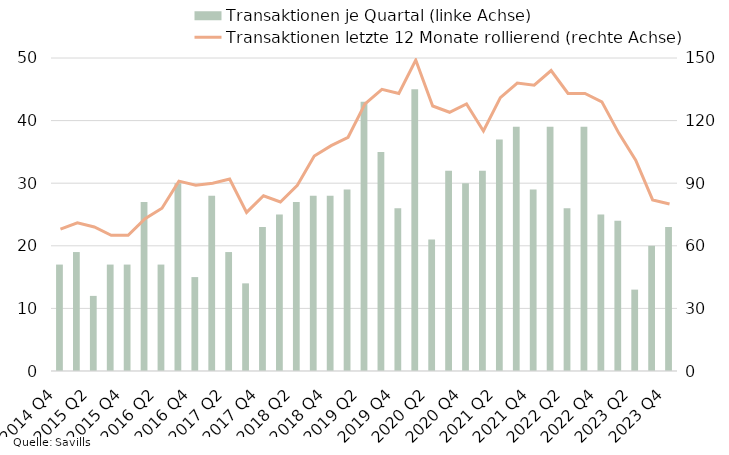
| Category | Transaktionen je Quartal (linke Achse) |
|---|---|
| 2014 Q4 | 17 |
| 2015 Q1 | 19 |
| 2015 Q2 | 12 |
| 2015 Q3 | 17 |
| 2015 Q4 | 17 |
| 2016 Q1 | 27 |
| 2016 Q2 | 17 |
| 2016 Q3 | 30 |
| 2016 Q4 | 15 |
| 2017 Q1 | 28 |
| 2017 Q2 | 19 |
| 2017 Q3 | 14 |
| 2017 Q4 | 23 |
| 2018 Q1 | 25 |
| 2018 Q2 | 27 |
| 2018 Q3 | 28 |
| 2018 Q4 | 28 |
| 2019 Q1 | 29 |
| 2019 Q2 | 43 |
| 2019 Q3 | 35 |
| 2019 Q4 | 26 |
| 2020 Q1 | 45 |
| 2020 Q2 | 21 |
| 2020 Q3 | 32 |
| 2020 Q4 | 30 |
| 2021 Q1 | 32 |
| 2021 Q2 | 37 |
| 2021 Q3 | 39 |
| 2021 Q4 | 29 |
| 2022 Q1 | 39 |
| 2022 Q2 | 26 |
| 2022 Q3 | 39 |
| 2022 Q4 | 25 |
| 2023 Q1 | 24 |
| 2023 Q2 | 13 |
| 2023 Q3 | 20 |
| 2023 Q4 | 23 |